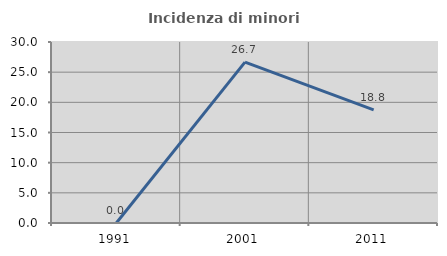
| Category | Incidenza di minori stranieri |
|---|---|
| 1991.0 | 0 |
| 2001.0 | 26.667 |
| 2011.0 | 18.75 |